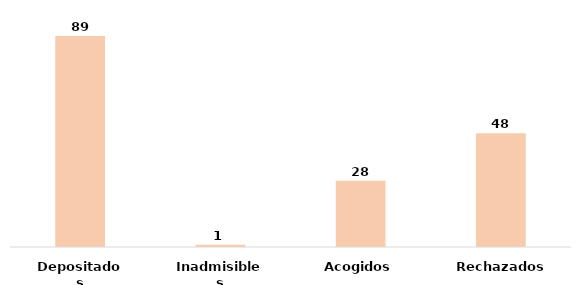
| Category | Series 0 |
|---|---|
| Depositados | 89 |
| Inadmisibles | 1 |
| Acogidos | 28 |
| Rechazados | 48 |